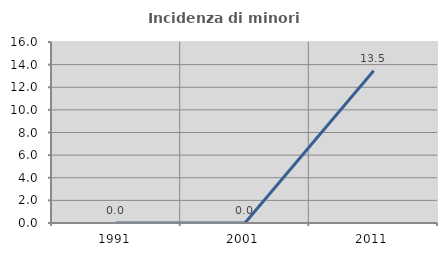
| Category | Incidenza di minori stranieri |
|---|---|
| 1991.0 | 0 |
| 2001.0 | 0 |
| 2011.0 | 13.462 |